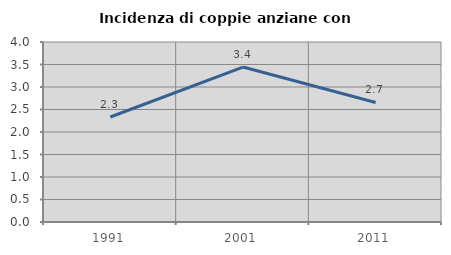
| Category | Incidenza di coppie anziane con figli |
|---|---|
| 1991.0 | 2.334 |
| 2001.0 | 3.443 |
| 2011.0 | 2.657 |